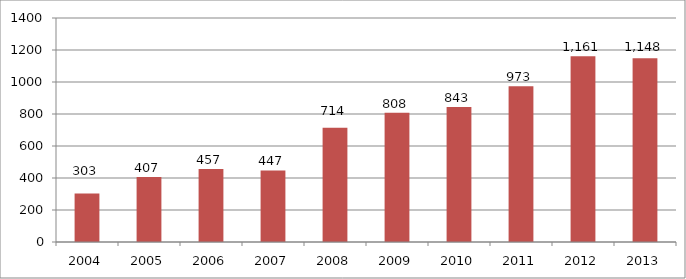
| Category | Series 1 |
|---|---|
| 2004.0 | 303 |
| 2005.0 | 407 |
| 2006.0 | 457 |
| 2007.0 | 447 |
| 2008.0 | 714 |
| 2009.0 | 808 |
| 2010.0 | 843 |
| 2011.0 | 973 |
| 2012.0 | 1161 |
| 2013.0 | 1148 |